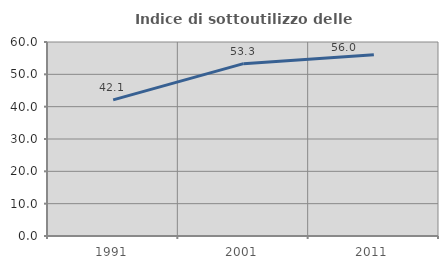
| Category | Indice di sottoutilizzo delle abitazioni  |
|---|---|
| 1991.0 | 42.112 |
| 2001.0 | 53.305 |
| 2011.0 | 56.034 |